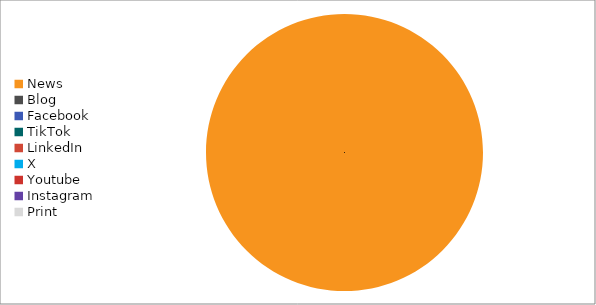
| Category | Series 0 |
|---|---|
| News | 2 |
| Blog | 0 |
| Facebook | 0 |
| TikTok | 0 |
| LinkedIn | 0 |
| X | 0 |
| Youtube | 0 |
| Instagram | 0 |
| Print | 0 |